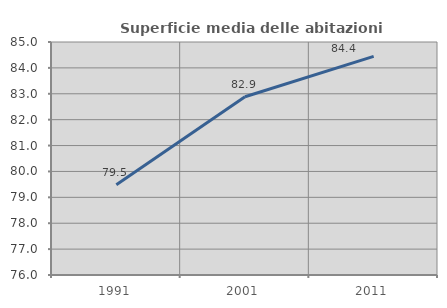
| Category | Superficie media delle abitazioni occupate |
|---|---|
| 1991.0 | 79.484 |
| 2001.0 | 82.883 |
| 2011.0 | 84.447 |